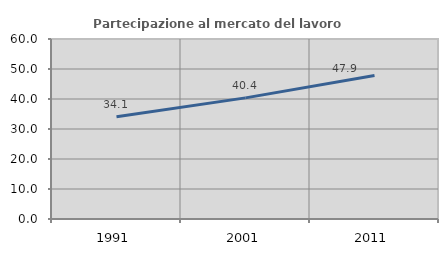
| Category | Partecipazione al mercato del lavoro  femminile |
|---|---|
| 1991.0 | 34.073 |
| 2001.0 | 40.377 |
| 2011.0 | 47.857 |